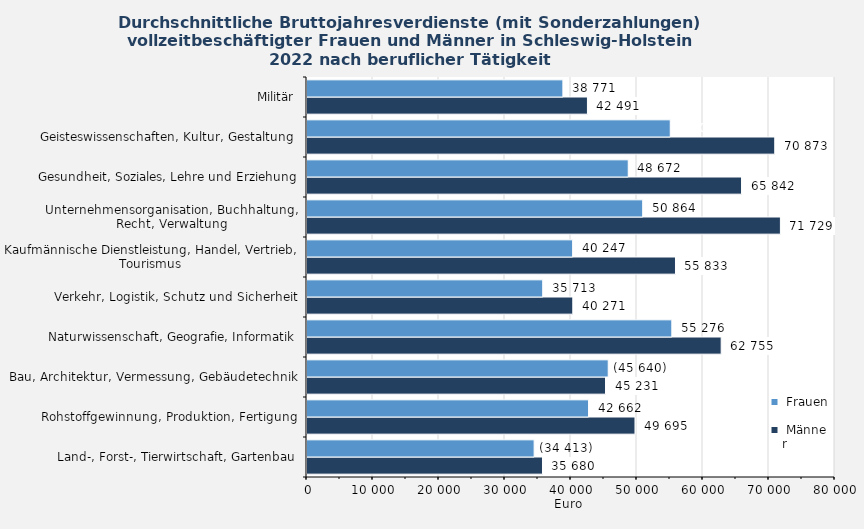
| Category |  Männer |  Frauen |
|---|---|---|
| Land-, Forst-, Tierwirtschaft, Gartenbau | 35680 | 34413 |
| Rohstoffgewinnung, Produktion, Fertigung | 49695 | 42662 |
| Bau, Architektur, Vermessung, Gebäudetechnik | 45231 | 45640 |
| Naturwissenschaft, Geografie, Informatik | 62755 | 55276 |
| Verkehr, Logistik, Schutz und Sicherheit | 40271 | 35713 |
| Kaufmännische Dienstleistung, Handel, Vertrieb, Tourismus | 55833 | 40247 |
| Unternehmensorganisation, Buchhaltung, Recht, Verwaltung | 71729 | 50864 |
| Gesundheit, Soziales, Lehre und Erziehung | 65842 | 48672 |
| Geisteswissenschaften, Kultur, Gestaltung | 70873 | 55038 |
| Militär | 42491 | 38771 |